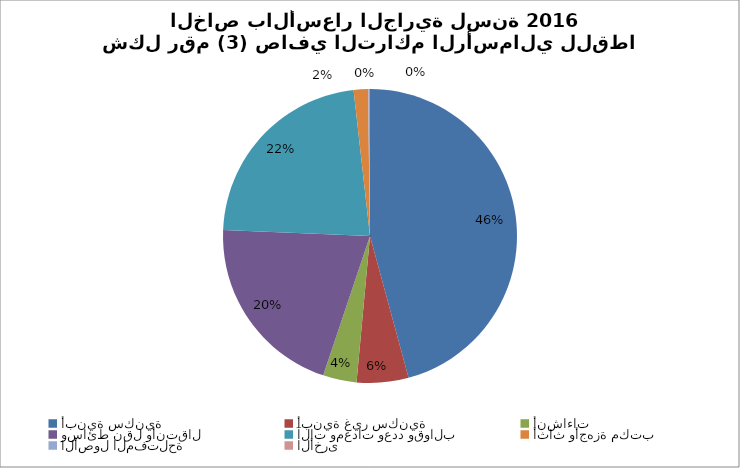
| Category | Series 0 |
|---|---|
| أبنية سكنية | 23595334.333 |
| أبنية غير سكنية | 2934897.039 |
| أنشاءات | 1902289.865 |
| وسائط نقل وأنتقال | 10571291.177 |
| آلات ومعدات وعدد وقوالب | 11627959.888 |
| أثاث وأجهزة مكتب | 804525.302 |
| الأصول المفتلحة | 33062.235 |
| الأخرى  | 80916.354 |